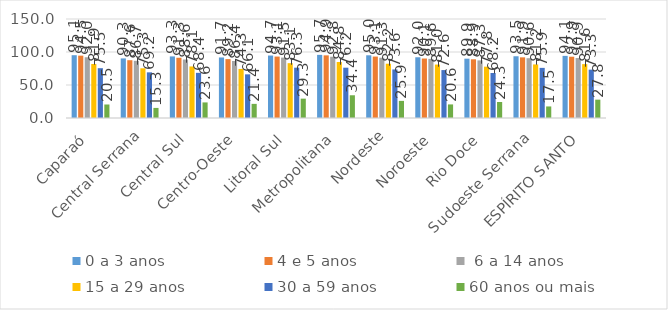
| Category | 0 a 3 anos | 4 e 5 anos |  6 a 14 anos | 15 a 29 anos | 30 a 59 anos | 60 anos ou mais |
|---|---|---|---|---|---|---|
| Caparaó | 95.149 | 94.47 | 92.04 | 81.859 | 75.472 | 20.467 |
| Central Serrana | 90.284 | 87.567 | 86.67 | 75.307 | 69.172 | 15.277 |
| Central Sul | 93.322 | 91.263 | 88.614 | 78.093 | 68.426 | 23.616 |
| Centro-Oeste | 91.715 | 89.236 | 86.383 | 74.341 | 66.127 | 21.418 |
| Litoral Sul | 94.658 | 93.073 | 91.516 | 83.076 | 76.285 | 29.325 |
| Metropolitana | 95.657 | 94.916 | 92.831 | 84.836 | 76.232 | 34.448 |
| Nordeste | 95.017 | 93.061 | 91.305 | 82.237 | 73.573 | 25.935 |
| Noroeste | 92.027 | 90.123 | 89.59 | 80.958 | 72.613 | 20.58 |
| Rio Doce | 89.894 | 88.938 | 87.294 | 77.781 | 68.214 | 24.279 |
| Sudoeste Serrana | 93.547 | 91.9 | 90.609 | 81.168 | 75.946 | 17.51 |
| ESPÍRITO SANTO | 94.13 | 92.857 | 90.866 | 81.635 | 73.258 | 27.797 |